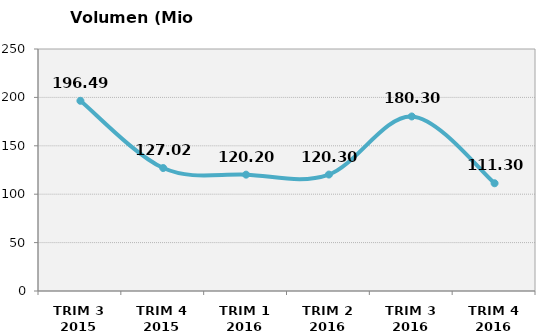
| Category | Volumen (Mio consumiciones) |
|---|---|
| TRIM 3 2015 | 196.49 |
| TRIM 4 2015 | 127.025 |
| TRIM 1 2016 | 120.2 |
| TRIM 2 2016 | 120.3 |
| TRIM 3 2016 | 180.3 |
| TRIM 4 2016 | 111.3 |